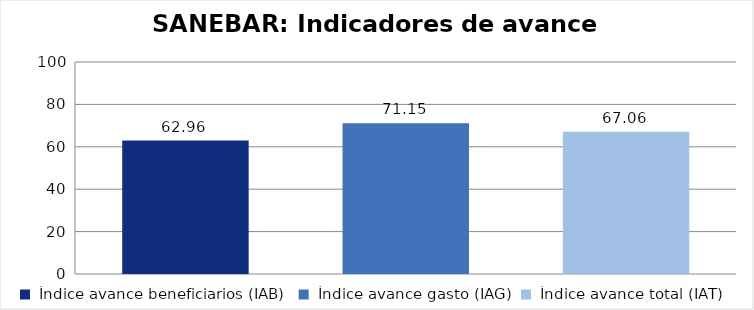
| Category | Total Programa |
|---|---|
| Índice avance beneficiarios (IAB)  | 62.963 |
| Índice avance gasto (IAG) | 71.148 |
| Índice avance total (IAT)  | 67.056 |